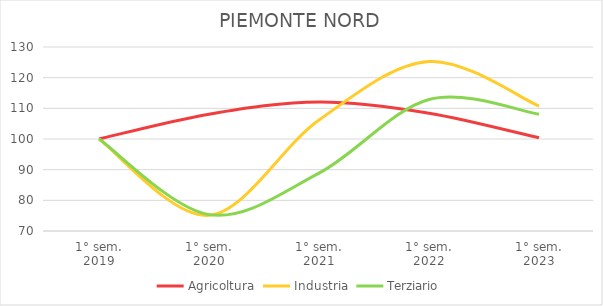
| Category | Agricoltura | Industria | Terziario |
|---|---|---|---|
| 1° sem.
2019 | 100 | 100 | 100 |
| 1° sem.
2020 | 108.102 | 75.105 | 75.341 |
| 1° sem.
2021 | 112.072 | 106.189 | 88.875 |
| 1° sem.
2022 | 108.428 | 125.279 | 112.894 |
| 1° sem.
2023 | 100.381 | 110.752 | 108.078 |